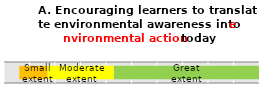
| Category | Series 0 | Series 1 | Series 2 |
|---|---|---|---|
|  | 57 | 26 | 11 |